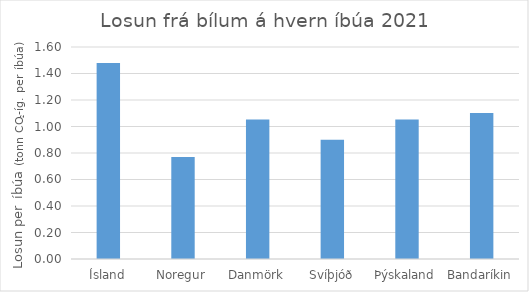
| Category | Losun frá vegasamgöngum á hvern íbúa 2021 (tonn CO2-íg. per íbúa) |
|---|---|
| Ísland | 1.48 |
| Noregur | 0.77 |
| Danmörk | 1.053 |
| Svíþjóð | 0.9 |
| Þýskaland | 1.054 |
| Bandaríkin | 1.101 |